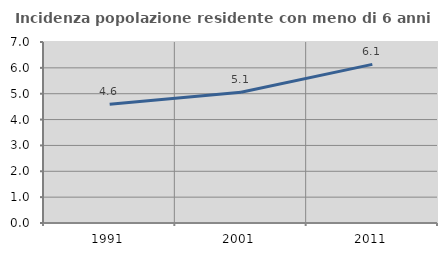
| Category | Incidenza popolazione residente con meno di 6 anni |
|---|---|
| 1991.0 | 4.594 |
| 2001.0 | 5.06 |
| 2011.0 | 6.134 |